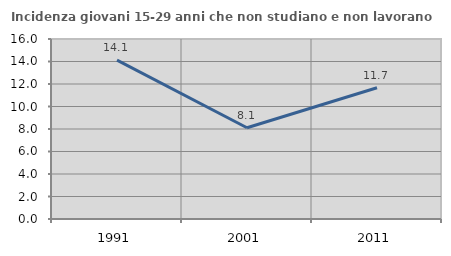
| Category | Incidenza giovani 15-29 anni che non studiano e non lavorano  |
|---|---|
| 1991.0 | 14.128 |
| 2001.0 | 8.112 |
| 2011.0 | 11.663 |